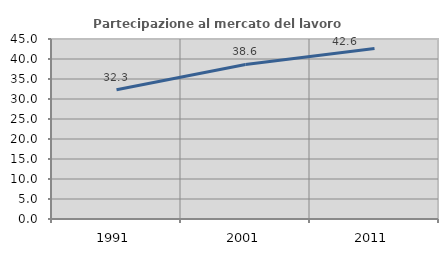
| Category | Partecipazione al mercato del lavoro  femminile |
|---|---|
| 1991.0 | 32.32 |
| 2001.0 | 38.629 |
| 2011.0 | 42.644 |